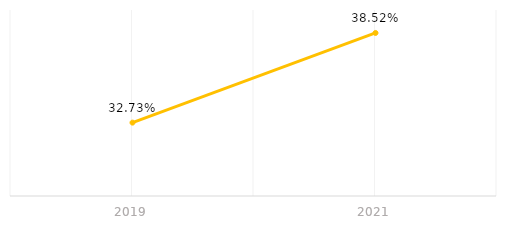
| Category | Series 0 |
|---|---|
| 2019.0 | 0.327 |
| 2021.0 | 0.385 |